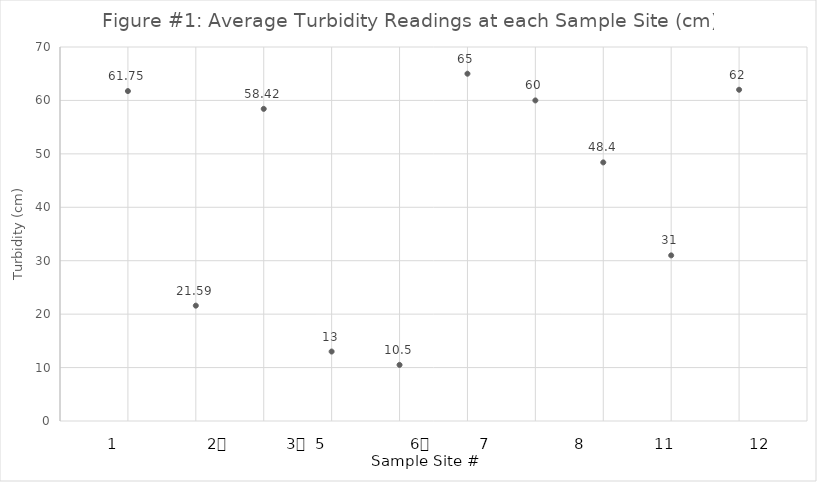
| Category | Series 0 |
|---|---|
| 0 | 61.75 |
| 1 | 21.59 |
| 2 | 58.42 |
| 3 | 13 |
| 4 | 10.5 |
| 5 | 65 |
| 6 | 60 |
| 7 | 48.4 |
| 8 | 31 |
| 9 | 62 |